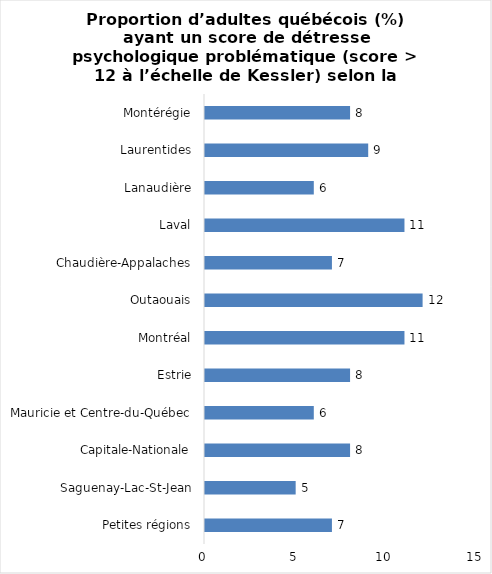
| Category | Series 0 |
|---|---|
| Petites régions | 7 |
| Saguenay-Lac-St-Jean | 5 |
| Capitale-Nationale | 8 |
| Mauricie et Centre-du-Québec | 6 |
| Estrie | 8 |
| Montréal | 11 |
| Outaouais | 12 |
| Chaudière-Appalaches | 7 |
| Laval | 11 |
| Lanaudière | 6 |
| Laurentides | 9 |
| Montérégie | 8 |